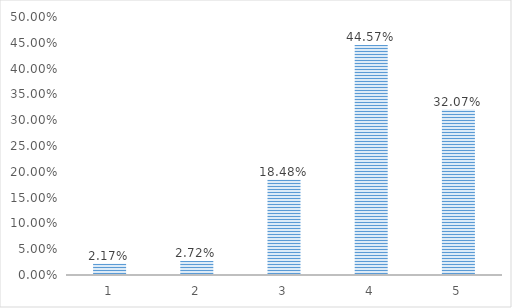
| Category | Series 0 |
|---|---|
| 1.0 | 0.022 |
| 2.0 | 0.027 |
| 3.0 | 0.185 |
| 4.0 | 0.446 |
| 5.0 | 0.321 |